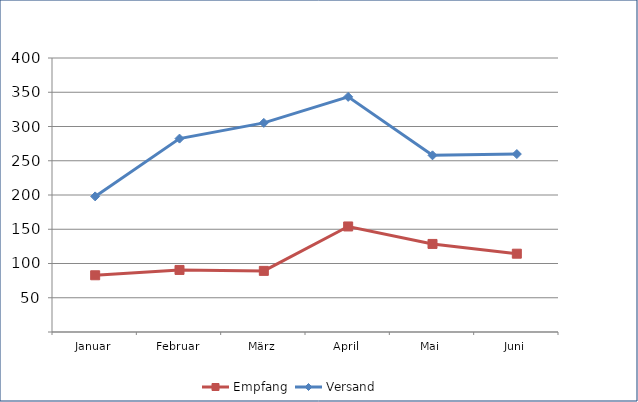
| Category | Empfang | Versand |
|---|---|---|
| Januar | 82.823 | 197.968 |
| Februar | 90.602 | 282.328 |
| März | 89.227 | 305.267 |
| April | 154.074 | 343.254 |
| Mai | 128.564 | 257.92 |
| Juni | 114.311 | 259.779 |